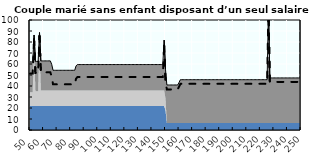
| Category | Coin fiscal marginal (somme des composantes) | Taux d’imposition marginal net |
|---|---|---|
| 50.0 | 61.922 | 51.275 |
| 51.0 | 61.922 | 51.275 |
| 52.0 | 61.922 | 51.275 |
| 53.0 | 86.368 | 82.557 |
| 54.0 | 62.374 | 51.855 |
| 55.0 | 62.374 | 51.855 |
| 56.0 | 62.374 | 51.855 |
| 57.0 | 88.632 | 85.453 |
| 58.0 | 62.827 | 52.434 |
| 59.0 | 62.827 | 52.434 |
| 60.0 | 62.827 | 52.434 |
| 61.0 | 62.827 | 52.434 |
| 62.0 | 62.827 | 52.434 |
| 63.0 | 62.827 | 52.434 |
| 64.0 | 62.827 | 52.434 |
| 65.0 | 62.827 | 52.434 |
| 66.0 | 59.754 | 48.502 |
| 67.0 | 54.28 | 41.497 |
| 68.0 | 54.28 | 41.497 |
| 69.0 | 54.28 | 41.497 |
| 70.0 | 54.28 | 41.497 |
| 71.0 | 54.28 | 41.497 |
| 72.0 | 54.28 | 41.497 |
| 73.0 | 54.28 | 41.497 |
| 74.0 | 54.28 | 41.497 |
| 75.0 | 54.28 | 41.497 |
| 76.0 | 54.28 | 41.497 |
| 77.0 | 54.28 | 41.497 |
| 78.0 | 54.28 | 41.497 |
| 79.0 | 54.28 | 41.497 |
| 80.0 | 54.28 | 41.497 |
| 81.0 | 54.28 | 41.497 |
| 82.0 | 54.28 | 41.497 |
| 83.0 | 54.28 | 41.497 |
| 84.0 | 58.313 | 46.658 |
| 85.0 | 59.49 | 48.164 |
| 86.0 | 59.49 | 48.164 |
| 87.0 | 59.49 | 48.164 |
| 88.0 | 59.49 | 48.164 |
| 89.0 | 59.49 | 48.164 |
| 90.0 | 59.49 | 48.164 |
| 91.0 | 59.49 | 48.164 |
| 92.0 | 59.49 | 48.164 |
| 93.0 | 59.49 | 48.164 |
| 94.0 | 59.49 | 48.164 |
| 95.0 | 59.49 | 48.164 |
| 96.0 | 59.49 | 48.164 |
| 97.0 | 59.49 | 48.164 |
| 98.0 | 59.49 | 48.164 |
| 99.0 | 59.49 | 48.164 |
| 100.0 | 59.49 | 48.164 |
| 101.0 | 59.49 | 48.164 |
| 102.0 | 59.49 | 48.164 |
| 103.0 | 59.49 | 48.164 |
| 104.0 | 59.49 | 48.164 |
| 105.0 | 59.49 | 48.164 |
| 106.0 | 59.49 | 48.164 |
| 107.0 | 59.49 | 48.164 |
| 108.0 | 59.49 | 48.164 |
| 109.0 | 59.49 | 48.164 |
| 110.0 | 59.49 | 48.164 |
| 111.0 | 59.49 | 48.164 |
| 112.0 | 59.49 | 48.164 |
| 113.0 | 59.49 | 48.164 |
| 114.0 | 59.49 | 48.164 |
| 115.0 | 59.49 | 48.164 |
| 116.0 | 59.49 | 48.164 |
| 117.0 | 59.49 | 48.164 |
| 118.0 | 59.49 | 48.164 |
| 119.0 | 59.49 | 48.164 |
| 120.0 | 59.49 | 48.164 |
| 121.0 | 59.49 | 48.164 |
| 122.0 | 59.49 | 48.164 |
| 123.0 | 59.49 | 48.164 |
| 124.0 | 59.49 | 48.164 |
| 125.0 | 59.49 | 48.164 |
| 126.0 | 59.49 | 48.164 |
| 127.0 | 59.49 | 48.164 |
| 128.0 | 59.49 | 48.164 |
| 129.0 | 59.49 | 48.164 |
| 130.0 | 59.49 | 48.164 |
| 131.0 | 59.49 | 48.164 |
| 132.0 | 59.49 | 48.164 |
| 133.0 | 59.49 | 48.164 |
| 134.0 | 59.49 | 48.164 |
| 135.0 | 59.49 | 48.164 |
| 136.0 | 59.49 | 48.164 |
| 137.0 | 59.49 | 48.164 |
| 138.0 | 59.49 | 48.164 |
| 139.0 | 59.49 | 48.164 |
| 140.0 | 59.49 | 48.164 |
| 141.0 | 59.49 | 48.164 |
| 142.0 | 59.49 | 48.164 |
| 143.0 | 59.49 | 48.164 |
| 144.0 | 59.49 | 48.164 |
| 145.0 | 59.49 | 48.164 |
| 146.0 | 59.49 | 48.164 |
| 147.0 | 59.49 | 48.164 |
| 148.0 | 59.49 | 48.164 |
| 149.0 | 81.749 | 76.646 |
| 150.0 | 54.998 | 45.037 |
| 151.0 | 40.933 | 36.857 |
| 152.0 | 40.933 | 36.857 |
| 153.0 | 40.933 | 36.857 |
| 154.0 | 40.933 | 36.857 |
| 155.0 | 40.933 | 36.857 |
| 156.0 | 40.933 | 36.857 |
| 157.0 | 40.933 | 36.857 |
| 158.0 | 40.933 | 36.857 |
| 159.0 | 40.933 | 36.857 |
| 160.0 | 43.258 | 39.343 |
| 161.0 | 45.744 | 42 |
| 162.0 | 45.744 | 42 |
| 163.0 | 45.744 | 42 |
| 164.0 | 45.744 | 42 |
| 165.0 | 45.744 | 42 |
| 166.0 | 45.744 | 42 |
| 167.0 | 45.744 | 42 |
| 168.0 | 45.744 | 42 |
| 169.0 | 45.744 | 42 |
| 170.0 | 45.744 | 42 |
| 171.0 | 45.744 | 42 |
| 172.0 | 45.744 | 42 |
| 173.0 | 45.744 | 42 |
| 174.0 | 45.744 | 42 |
| 175.0 | 45.744 | 42 |
| 176.0 | 45.744 | 42 |
| 177.0 | 45.744 | 42 |
| 178.0 | 45.744 | 42 |
| 179.0 | 45.744 | 42 |
| 180.0 | 45.744 | 42 |
| 181.0 | 45.744 | 42 |
| 182.0 | 45.744 | 42 |
| 183.0 | 45.744 | 42 |
| 184.0 | 45.744 | 42 |
| 185.0 | 45.744 | 42 |
| 186.0 | 45.744 | 42 |
| 187.0 | 45.744 | 42 |
| 188.0 | 45.744 | 42 |
| 189.0 | 45.744 | 42 |
| 190.0 | 45.744 | 42 |
| 191.0 | 45.744 | 42 |
| 192.0 | 45.744 | 42 |
| 193.0 | 45.744 | 42 |
| 194.0 | 45.744 | 42 |
| 195.0 | 45.744 | 42 |
| 196.0 | 45.744 | 42 |
| 197.0 | 45.744 | 42 |
| 198.0 | 45.744 | 42 |
| 199.0 | 45.744 | 42 |
| 200.0 | 45.744 | 42 |
| 201.0 | 45.744 | 42 |
| 202.0 | 45.744 | 42 |
| 203.0 | 45.744 | 42 |
| 204.0 | 45.744 | 42 |
| 205.0 | 45.744 | 42 |
| 206.0 | 45.744 | 42 |
| 207.0 | 45.744 | 42 |
| 208.0 | 45.744 | 42 |
| 209.0 | 45.744 | 42 |
| 210.0 | 45.744 | 42 |
| 211.0 | 45.744 | 42 |
| 212.0 | 45.744 | 42 |
| 213.0 | 45.744 | 42 |
| 214.0 | 45.744 | 42 |
| 215.0 | 45.744 | 42 |
| 216.0 | 45.744 | 42 |
| 217.0 | 45.744 | 42 |
| 218.0 | 45.744 | 42 |
| 219.0 | 45.744 | 42 |
| 220.0 | 45.744 | 42 |
| 221.0 | 45.744 | 42 |
| 222.0 | 45.744 | 42 |
| 223.0 | 45.744 | 42 |
| 224.0 | 45.744 | 42 |
| 225.0 | 45.744 | 42 |
| 226.0 | 112.394 | 113.249 |
| 227.0 | 47.347 | 43.714 |
| 228.0 | 47.347 | 43.714 |
| 229.0 | 47.347 | 43.714 |
| 230.0 | 47.347 | 43.714 |
| 231.0 | 47.347 | 43.714 |
| 232.0 | 47.347 | 43.714 |
| 233.0 | 47.347 | 43.714 |
| 234.0 | 47.347 | 43.714 |
| 235.0 | 47.347 | 43.714 |
| 236.0 | 47.347 | 43.714 |
| 237.0 | 47.347 | 43.714 |
| 238.0 | 47.347 | 43.714 |
| 239.0 | 47.347 | 43.714 |
| 240.0 | 47.347 | 43.714 |
| 241.0 | 47.347 | 43.714 |
| 242.0 | 47.347 | 43.714 |
| 243.0 | 47.347 | 43.714 |
| 244.0 | 47.347 | 43.714 |
| 245.0 | 47.347 | 43.714 |
| 246.0 | 47.347 | 43.714 |
| 247.0 | 47.347 | 43.714 |
| 248.0 | 47.347 | 43.714 |
| 249.0 | 47.347 | 43.714 |
| 250.0 | 47.347 | 43.714 |